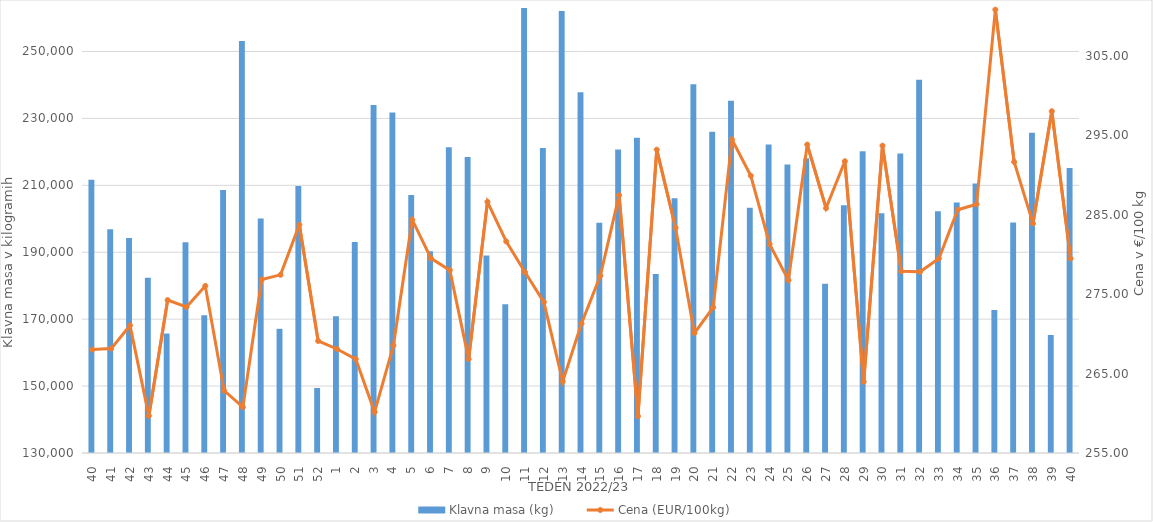
| Category | Klavna masa (kg) |
|---|---|
| 40.0 | 211635 |
| 41.0 | 196841 |
| 42.0 | 194271 |
| 43.0 | 182399 |
| 44.0 | 165696 |
| 45.0 | 193022 |
| 46.0 | 171172 |
| 47.0 | 208597 |
| 48.0 | 253151 |
| 49.0 | 200117 |
| 50.0 | 167119 |
| 51.0 | 209797 |
| 52.0 | 149439 |
| 1.0 | 170843 |
| 2.0 | 193093 |
| 3.0 | 234042 |
| 4.0 | 231737 |
| 5.0 | 207136 |
| 6.0 | 190311 |
| 7.0 | 221366 |
| 8.0 | 218470 |
| 9.0 | 189006 |
| 10.0 | 174425 |
| 11.0 | 265476 |
| 12.0 | 221171 |
| 13.0 | 262102 |
| 14.0 | 237813 |
| 15.0 | 198828 |
| 16.0 | 220686 |
| 17.0 | 224192 |
| 18.0 | 183508 |
| 19.0 | 206133 |
| 20.0 | 240223 |
| 21.0 | 226050 |
| 22.0 | 235273 |
| 23.0 | 203306 |
| 24.0 | 222178 |
| 25.0 | 216259 |
| 26.0 | 218064 |
| 27.0 | 180556 |
| 28.0 | 204078 |
| 29.0 | 220162 |
| 30.0 | 201649 |
| 31.0 | 219538 |
| 32.0 | 241549 |
| 33.0 | 202261 |
| 34.0 | 204903 |
| 35.0 | 210575 |
| 36.0 | 172745 |
| 37.0 | 198877 |
| 38.0 | 225730 |
| 39.0 | 165273 |
| 40.0 | 215175 |